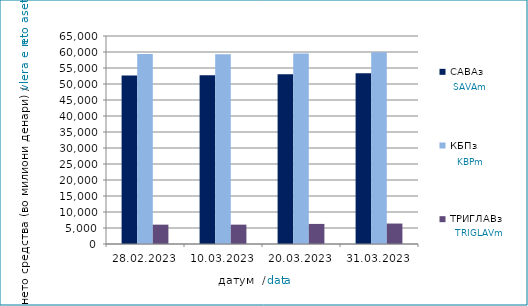
| Category | САВАз | КБПз | ТРИГЛАВз |
|---|---|---|---|
| 2023-02-28 | 52669.908 | 59382.381 | 6046.69 |
| 2023-03-10 | 52747.695 | 59319.559 | 6048.729 |
| 2023-03-20 | 53016.334 | 59511.804 | 6275.312 |
| 2023-03-31 | 53360.985 | 59885.007 | 6391.885 |